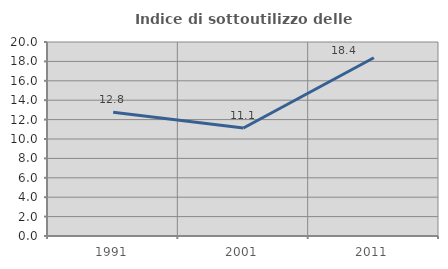
| Category | Indice di sottoutilizzo delle abitazioni  |
|---|---|
| 1991.0 | 12.766 |
| 2001.0 | 11.134 |
| 2011.0 | 18.382 |